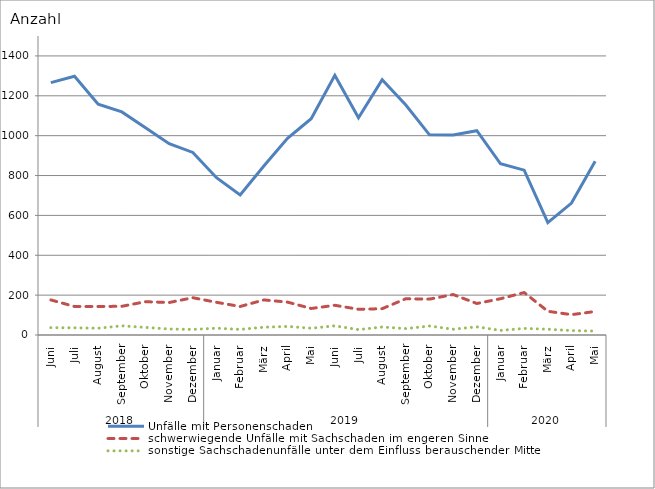
| Category | Unfälle mit Personenschaden | schwerwiegende Unfälle mit Sachschaden im engeren Sinne | sonstige Sachschadenunfälle unter dem Einfluss berauschender Mittel |
|---|---|---|---|
| 0 | 1266 | 176 | 37 |
| 1 | 1298 | 143 | 36 |
| 2 | 1158 | 143 | 34 |
| 3 | 1119 | 144 | 46 |
| 4 | 1040 | 167 | 38 |
| 5 | 960 | 163 | 30 |
| 6 | 916 | 187 | 28 |
| 7 | 789 | 164 | 34 |
| 8 | 702 | 143 | 28 |
| 9 | 848 | 176 | 39 |
| 10 | 987 | 165 | 43 |
| 11 | 1085 | 133 | 34 |
| 12 | 1303 | 149 | 46 |
| 13 | 1090 | 129 | 27 |
| 14 | 1281 | 132 | 40 |
| 15 | 1154 | 182 | 32 |
| 16 | 1004 | 180 | 45 |
| 17 | 1003 | 203 | 29 |
| 18 | 1025 | 158 | 41 |
| 19 | 859 | 182 | 23 |
| 20 | 827 | 213 | 33 |
| 21 | 564 | 119 | 29 |
| 22 | 662 | 102 | 22 |
| 23 | 872 | 118 | 20 |